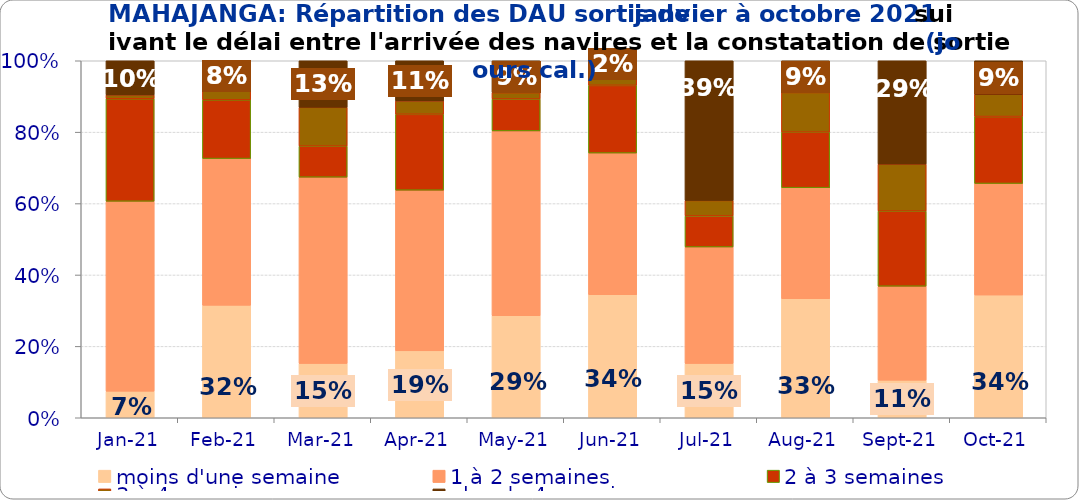
| Category | moins d'une semaine | 1 à 2 semaines | 2 à 3 semaines | 3 à 4 semaines | plus de 4 semaines |
|---|---|---|---|---|---|
| 2021-01-01 | 0.074 | 0.532 | 0.287 | 0.011 | 0.096 |
| 2021-02-01 | 0.315 | 0.411 | 0.164 | 0.027 | 0.082 |
| 2021-03-01 | 0.152 | 0.522 | 0.087 | 0.109 | 0.13 |
| 2021-04-01 | 0.188 | 0.45 | 0.212 | 0.038 | 0.112 |
| 2021-05-01 | 0.286 | 0.518 | 0.089 | 0.018 | 0.089 |
| 2021-06-01 | 0.345 | 0.397 | 0.19 | 0.052 | 0.017 |
| 2021-07-01 | 0.152 | 0.326 | 0.087 | 0.043 | 0.391 |
| 2021-08-01 | 0.333 | 0.311 | 0.156 | 0.111 | 0.089 |
| 2021-09-01 | 0.105 | 0.263 | 0.211 | 0.132 | 0.289 |
| 2021-10-01 | 0.344 | 0.312 | 0.188 | 0.062 | 0.094 |